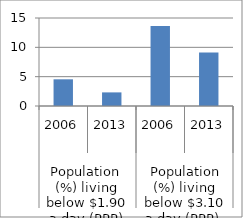
| Category | Series 0 |
|---|---|
| 0 | 4.55 |
| 1 | 2.32 |
| 2 | 13.63 |
| 3 | 9.12 |